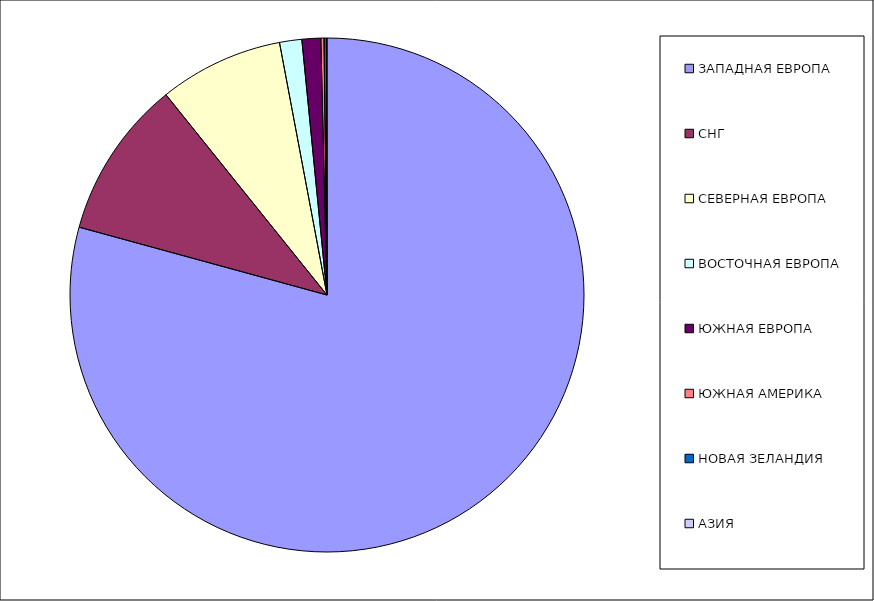
| Category | Оборот |
|---|---|
| ЗАПАДНАЯ ЕВРОПА | 0.793 |
| СНГ | 0.1 |
| СЕВЕРНАЯ ЕВРОПА | 0.078 |
| ВОСТОЧНАЯ ЕВРОПА | 0.014 |
| ЮЖНАЯ ЕВРОПА | 0.012 |
| ЮЖНАЯ АМЕРИКА | 0.002 |
| НОВАЯ ЗЕЛАНДИЯ | 0.002 |
| АЗИЯ | 0 |